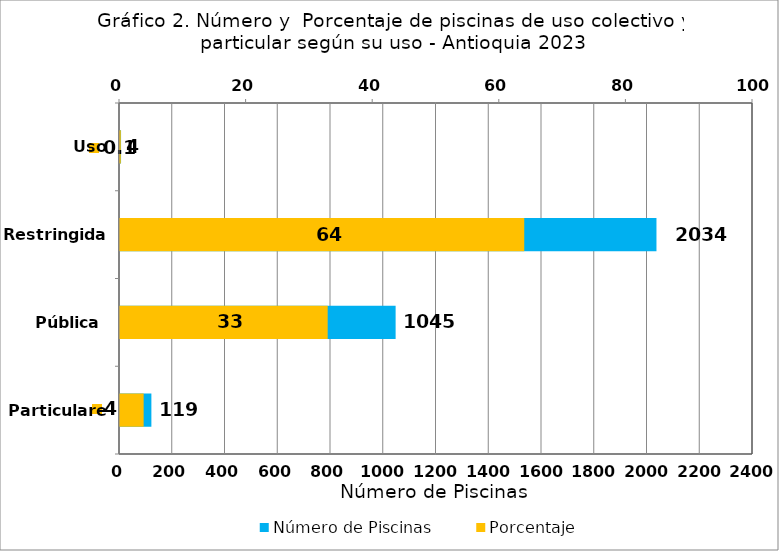
| Category | Número de Piscinas |
|---|---|
| Particulares | 119 |
| Pública | 1045 |
| Restringida | 2034 |
| Uso Especial | 4 |